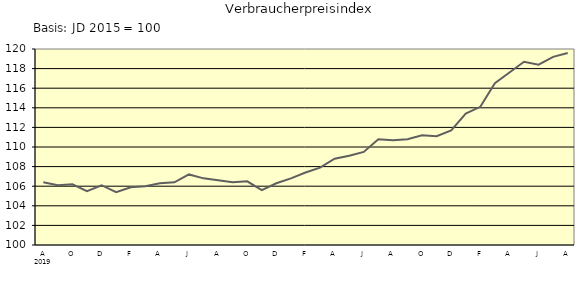
| Category | Series 0 |
|---|---|
| 0 | 106.4 |
| 1 | 106.1 |
| 2 | 106.2 |
| 3 | 105.5 |
| 4 | 106.1 |
| 5 | 105.4 |
| 6 | 105.9 |
| 7 | 106 |
| 8 | 106.3 |
| 9 | 106.4 |
| 10 | 107.2 |
| 11 | 106.8 |
| 12 | 106.6 |
| 13 | 106.4 |
| 14 | 106.5 |
| 15 | 105.6 |
| 16 | 106.3 |
| 17 | 106.8 |
| 18 | 107.4 |
| 19 | 107.9 |
| 20 | 108.8 |
| 21 | 109.1 |
| 22 | 109.5 |
| 23 | 110.8 |
| 24 | 110.7 |
| 25 | 110.8 |
| 26 | 111.2 |
| 27 | 111.1 |
| 28 | 111.7 |
| 29 | 113.4 |
| 30 | 114.1 |
| 31 | 116.5 |
| 32 | 117.6 |
| 33 | 118.7 |
| 34 | 118.4 |
| 35 | 119.2 |
| 36 | 119.6 |